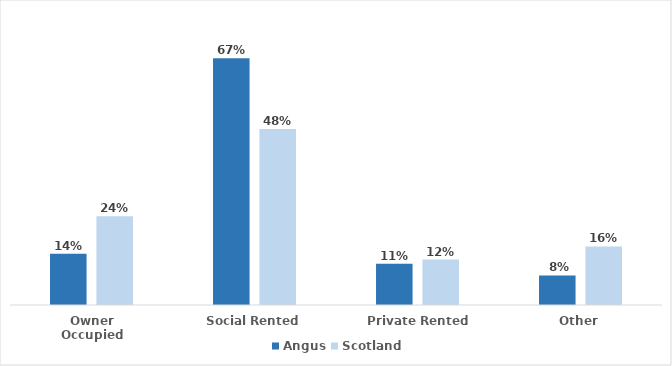
| Category | Angus | Scotland |
|---|---|---|
| Owner Occupied | 0.139 | 0.241 |
| Social Rented | 0.669 | 0.477 |
| Private Rented | 0.112 | 0.123 |
| Other | 0.08 | 0.159 |